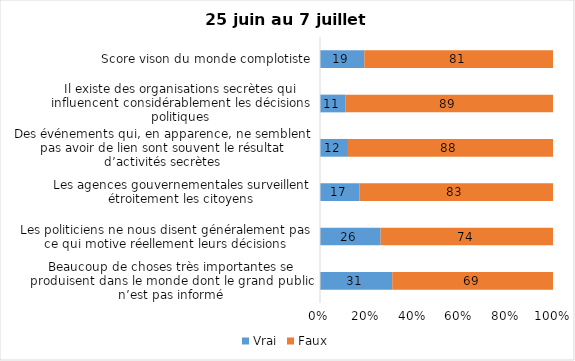
| Category | Vrai | Faux |
|---|---|---|
| Beaucoup de choses très importantes se produisent dans le monde dont le grand public n’est pas informé | 31 | 69 |
| Les politiciens ne nous disent généralement pas ce qui motive réellement leurs décisions | 26 | 74 |
| Les agences gouvernementales surveillent étroitement les citoyens | 17 | 83 |
| Des événements qui, en apparence, ne semblent pas avoir de lien sont souvent le résultat d’activités secrètes | 12 | 88 |
| Il existe des organisations secrètes qui influencent considérablement les décisions politiques | 11 | 89 |
| Score vison du monde complotiste | 19 | 81 |